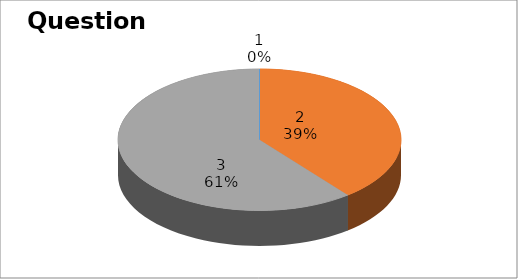
| Category | Series 0 |
|---|---|
| 0 | 0 |
| 1 | 11 |
| 2 | 17 |